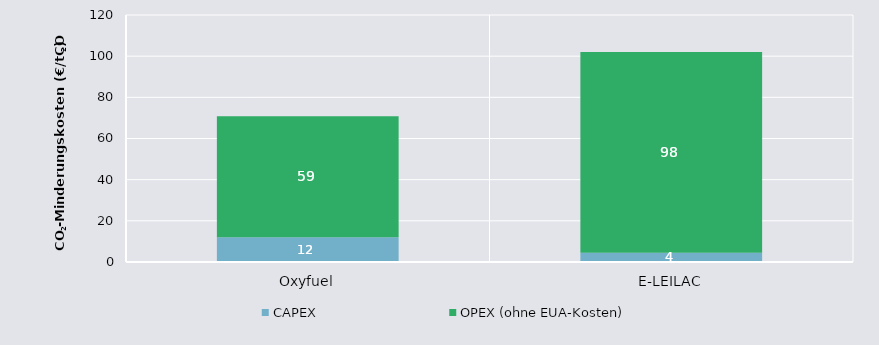
| Category | CAPEX | OPEX (ohne EUA-Kosten) |
|---|---|---|
| Oxyfuel | 11.994 | 58.809 |
| E-LEILAC | 4.472 | 97.568 |